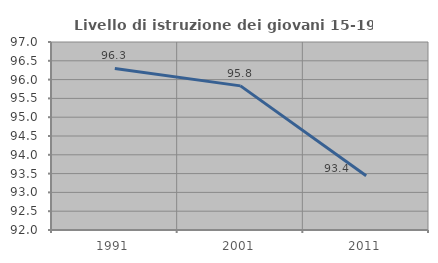
| Category | Livello di istruzione dei giovani 15-19 anni |
|---|---|
| 1991.0 | 96.296 |
| 2001.0 | 95.833 |
| 2011.0 | 93.443 |